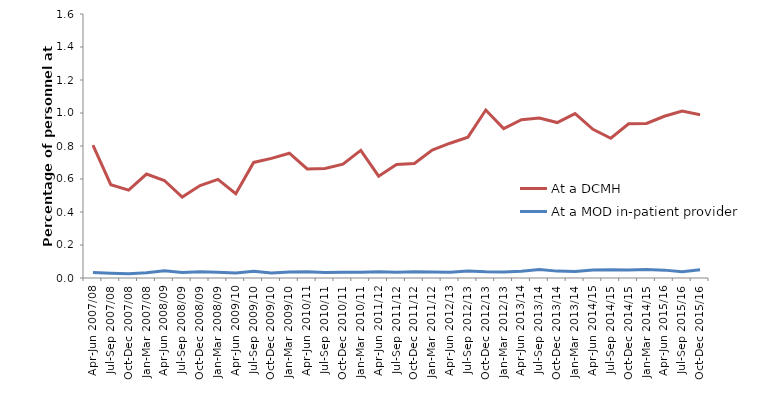
| Category | At a DCMH | At a MOD in-patient provider |
|---|---|---|
| Apr-Jun 2007/08 | 0.805 | 0.033 |
| Jul-Sep 2007/08 | 0.565 | 0.029 |
| Oct-Dec 2007/08 | 0.532 | 0.025 |
| Jan-Mar 2007/08 | 0.63 | 0.032 |
| Apr-Jun 2008/09 | 0.591 | 0.044 |
| Jul-Sep 2008/09 | 0.491 | 0.034 |
| Oct-Dec 2008/09 | 0.56 | 0.038 |
| Jan-Mar 2008/09 | 0.598 | 0.034 |
| Apr-Jun 2009/10 | 0.511 | 0.031 |
| Jul-Sep 2009/10 | 0.7 | 0.04 |
| Oct-Dec 2009/10 | 0.725 | 0.03 |
| Jan-Mar 2009/10 | 0.756 | 0.036 |
| Apr-Jun 2010/11 | 0.661 | 0.038 |
| Jul-Sep 2010/11 | 0.663 | 0.033 |
| Oct-Dec 2010/11 | 0.69 | 0.035 |
| Jan-Mar 2010/11 | 0.774 | 0.034 |
| Apr-Jun 2011/12 | 0.617 | 0.039 |
| Jul-Sep 2011/12 | 0.688 | 0.034 |
| Oct-Dec 2011/12 | 0.694 | 0.038 |
| Jan-Mar 2011/12 | 0.775 | 0.036 |
| Apr-Jun 2012/13 | 0.817 | 0.035 |
| Jul-Sep 2012/13 | 0.854 | 0.043 |
| Oct-Dec 2012/13 | 1.018 | 0.037 |
| Jan-Mar 2012/13 | 0.906 | 0.037 |
| Apr-Jun 2013/14 | 0.96 | 0.041 |
| Jul-Sep 2013/14 | 0.97 | 0.051 |
| Oct-Dec 2013/14 | 0.942 | 0.042 |
| Jan-Mar 2013/14 | 0.996 | 0.04 |
| Apr-Jun 2014/15 | 0.901 | 0.049 |
| Jul-Sep 2014/15 | 0.847 | 0.05 |
| Oct-Dec 2014/15 | 0.935 | 0.048 |
| Jan-Mar 2014/15 | 0.937 | 0.051 |
| Apr-Jun 2015/16 | 0.98 | 0.048 |
| Jul-Sep 2015/16 | 1.012 | 0.038 |
| Oct-Dec 2015/16 | 0.99 | 0.051 |